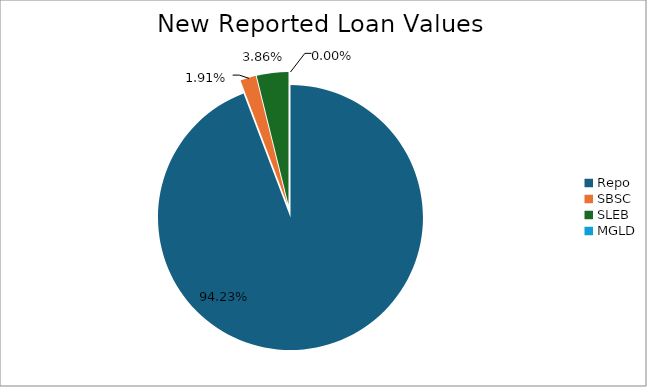
| Category | Series 0 |
|---|---|
| Repo | 11608896.571 |
| SBSC | 235390.598 |
| SLEB | 475002.181 |
| MGLD | 50.391 |